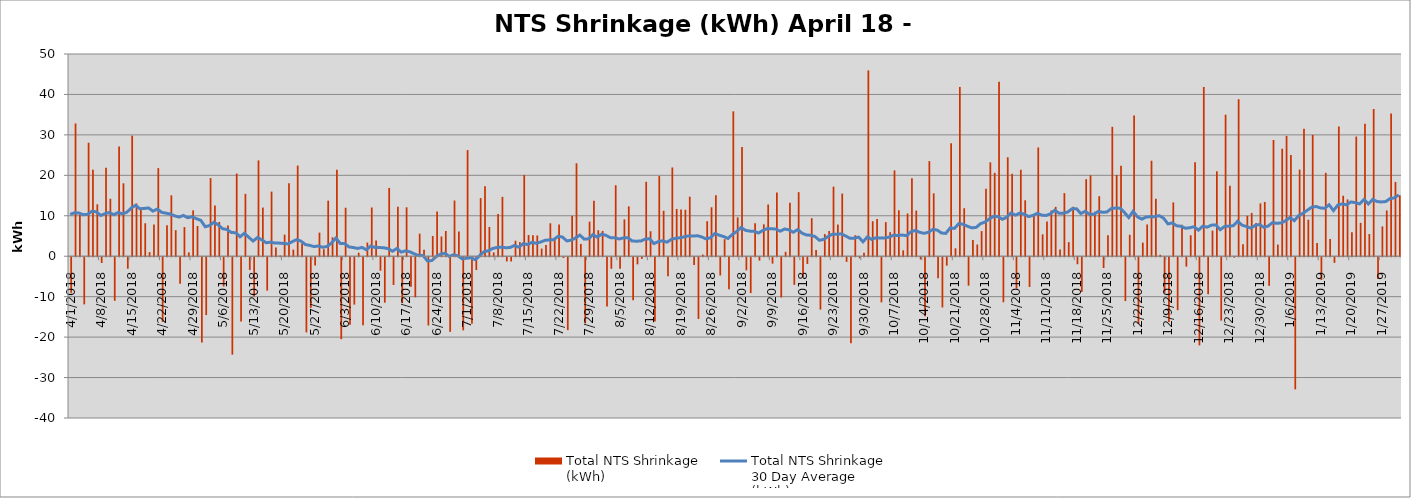
| Category | Total NTS Shrinkage
(kWh) |
|---|---|
| 4/1/18 | -8792530 |
| 4/2/18 | 32834545 |
| 4/3/18 | 10179991 |
| 4/4/18 | -11657593 |
| 4/5/18 | 28062721 |
| 4/6/18 | 21376540 |
| 4/7/18 | 12831044 |
| 4/8/18 | -1435382 |
| 4/9/18 | 21874602 |
| 4/10/18 | 14207387 |
| 4/11/18 | -10780226 |
| 4/12/18 | 27100684 |
| 4/13/18 | 18025390 |
| 4/14/18 | -2851554 |
| 4/15/18 | 29807993 |
| 4/16/18 | 13038217 |
| 4/17/18 | 11923369 |
| 4/18/18 | 8148474 |
| 4/19/18 | 1015356 |
| 4/20/18 | 7866046 |
| 4/21/18 | 21788290 |
| 4/22/18 | -16020216 |
| 4/23/18 | 7645514 |
| 4/24/18 | 15047579 |
| 4/25/18 | 6440771 |
| 4/26/18 | -6556387 |
| 4/27/18 | 7205433 |
| 4/28/18 | 945549 |
| 4/29/18 | 11339143 |
| 4/30/18 | 7467481 |
| 5/1/18 | -21088512 |
| 5/2/18 | -14309737 |
| 5/3/18 | 19314113 |
| 5/4/18 | 12513844 |
| 5/5/18 | 8476117 |
| 5/6/18 | -7231313 |
| 5/7/18 | 7584428 |
| 5/8/18 | -24085678 |
| 5/9/18 | 20438945 |
| 5/10/18 | -15920176 |
| 5/11/18 | 15421669 |
| 5/12/18 | -3150976 |
| 5/13/18 | -9720884 |
| 5/14/18 | 23687402 |
| 5/15/18 | 12031903 |
| 5/16/18 | -8251475 |
| 5/17/18 | 15979781 |
| 5/18/18 | 2153991 |
| 5/19/18 | 184363 |
| 5/20/18 | 5343752 |
| 5/21/18 | 18058094 |
| 5/22/18 | 1641055 |
| 5/23/18 | 22414349 |
| 5/24/18 | 3125869 |
| 5/25/18 | -18588789 |
| 5/26/18 | -12519348 |
| 5/27/18 | -2035233 |
| 5/28/18 | 5834420 |
| 5/29/18 | 1729932 |
| 5/30/18 | 13744297 |
| 5/31/18 | 4684604 |
| 6/1/18 | 21379042 |
| 6/2/18 | -20278760 |
| 6/3/18 | 11986756 |
| 6/4/18 | -16686667 |
| 6/5/18 | -11715027 |
| 6/6/18 | 872239 |
| 6/7/18 | -16791587 |
| 6/8/18 | 3376051 |
| 6/9/18 | 12048019 |
| 6/10/18 | 3911092 |
| 6/11/18 | -3335891 |
| 6/12/18 | -11243322 |
| 6/13/18 | 16888655 |
| 6/14/18 | -6868916 |
| 6/15/18 | 12234463 |
| 6/16/18 | -11335743 |
| 6/17/18 | 12097989 |
| 6/18/18 | -7272961 |
| 6/19/18 | -9910501 |
| 6/20/18 | 5584392 |
| 6/21/18 | 1604414 |
| 6/22/18 | -16865961 |
| 6/23/18 | 4991654 |
| 6/24/18 | 11036590 |
| 6/25/18 | 4880973 |
| 6/26/18 | 6230336 |
| 6/27/18 | -18451515 |
| 6/28/18 | 13772551 |
| 6/29/18 | 6140026 |
| 6/30/18 | -18080453 |
| 7/1/18 | 26241475 |
| 7/2/18 | -16474822 |
| 7/3/18 | -3160652 |
| 7/4/18 | 14371331 |
| 7/5/18 | 17290697 |
| 7/6/18 | 7242451 |
| 7/7/18 | 941301 |
| 7/8/18 | 10453916 |
| 7/9/18 | 14671011 |
| 7/10/18 | -1042026 |
| 7/11/18 | -1051272 |
| 7/12/18 | 3833283 |
| 7/13/18 | 3476910 |
| 7/14/18 | 20109509 |
| 7/15/18 | 5254840 |
| 7/16/18 | 5162329 |
| 7/17/18 | 5137844 |
| 7/18/18 | 1893712 |
| 7/19/18 | 2773134 |
| 7/20/18 | 8146507 |
| 7/21/18 | 4104264 |
| 7/22/18 | 7827355 |
| 7/23/18 | -184575 |
| 7/24/18 | -18015950 |
| 7/25/18 | 9986567 |
| 7/26/18 | 22976449 |
| 7/27/18 | 3037411 |
| 7/28/18 | -16343523 |
| 7/29/18 | 8550423 |
| 7/30/18 | 13703645 |
| 7/31/18 | 6421848 |
| 8/1/18 | 6258830 |
| 8/2/18 | -12188788 |
| 8/3/18 | -2855500 |
| 8/4/18 | 17554029 |
| 8/5/18 | -2845337 |
| 8/6/18 | 9120489 |
| 8/7/18 | 12320566 |
| 8/8/18 | -10645512 |
| 8/9/18 | -1767335 |
| 8/10/18 | -407770 |
| 8/11/18 | 18399787 |
| 8/12/18 | 6185348 |
| 8/13/18 | -15887183 |
| 8/14/18 | 19818877 |
| 8/15/18 | 11233864 |
| 8/16/18 | -4715098 |
| 8/17/18 | 21942572 |
| 8/18/18 | 11697655 |
| 8/19/18 | 11549996 |
| 8/20/18 | 11487185 |
| 8/21/18 | 14726911 |
| 8/22/18 | -1917939 |
| 8/23/18 | -15272931 |
| 8/24/18 | 399506 |
| 8/25/18 | 8655435 |
| 8/26/18 | 12107556 |
| 8/27/18 | 15056486 |
| 8/28/18 | -4513654 |
| 8/29/18 | 4216175 |
| 8/30/18 | -7897329 |
| 8/31/18 | 35826714 |
| 9/1/18 | 9608730 |
| 9/2/18 | 27022549 |
| 9/3/18 | -3240633 |
| 9/4/18 | -8869180 |
| 9/5/18 | 8126625 |
| 9/6/18 | -835503 |
| 9/7/18 | 7883601 |
| 9/8/18 | 12787875 |
| 9/9/18 | -1582848 |
| 9/10/18 | 15736286 |
| 9/11/18 | -9947753 |
| 9/12/18 | 1082880 |
| 9/13/18 | 13222377 |
| 9/14/18 | -6832433 |
| 9/15/18 | 15837461 |
| 9/16/18 | -5034067 |
| 9/17/18 | -1655632 |
| 9/18/18 | 9399716 |
| 9/19/18 | 1568137 |
| 9/20/18 | -12951900 |
| 9/21/18 | 5462340 |
| 9/22/18 | 6240296 |
| 9/23/18 | 17200996 |
| 9/24/18 | 7833984 |
| 9/25/18 | 15494095 |
| 9/26/18 | -1147991 |
| 9/27/18 | -21257782 |
| 9/28/18 | 5180946 |
| 9/29/18 | -255090 |
| 9/30/18 | 846703 |
| 10/1/18 | 45948300 |
| 10/2/18 | 8653339 |
| 10/3/18 | 9188847 |
| 10/4/18 | -11166997 |
| 10/5/18 | 8435426 |
| 10/6/18 | 5943948 |
| 10/7/18 | 21215707 |
| 10/8/18 | 11350171 |
| 10/9/18 | 1458014 |
| 10/10/18 | 10569147 |
| 10/11/18 | 19295146 |
| 10/12/18 | 11289663 |
| 10/13/18 | -559782 |
| 10/14/18 | -14605439 |
| 10/15/18 | 23511898 |
| 10/16/18 | 15543901 |
| 10/17/18 | -5185423 |
| 10/18/18 | -12417747 |
| 10/19/18 | -2087434 |
| 10/20/18 | 27921960 |
| 10/21/18 | 1960650 |
| 10/22/18 | 41854446 |
| 10/23/18 | 11861000 |
| 10/24/18 | -7043359 |
| 10/25/18 | 4031480 |
| 10/26/18 | 2888407 |
| 10/27/18 | 6217038 |
| 10/28/18 | 16657959 |
| 10/29/18 | 23217169 |
| 10/30/18 | 20609035 |
| 10/31/18 | 43128364 |
| 11/1/18 | -11132206 |
| 11/2/18 | 24476851 |
| 11/3/18 | 20388378 |
| 11/4/18 | -7745877 |
| 11/5/18 | 21380456 |
| 11/6/18 | 13830097 |
| 11/7/18 | -7354004 |
| 11/8/18 | 9927632 |
| 11/9/18 | 26893334 |
| 11/10/18 | 5409151 |
| 11/11/18 | 8613909 |
| 11/12/18 | 11319251 |
| 11/13/18 | 12198034 |
| 11/14/18 | 1669932 |
| 11/15/18 | 15600255 |
| 11/16/18 | 3471967 |
| 11/17/18 | 12242375 |
| 11/18/18 | -1740111 |
| 11/19/18 | -8573817 |
| 11/20/18 | 19043247 |
| 11/21/18 | 20002234 |
| 11/22/18 | 11004783 |
| 11/23/18 | 14837649 |
| 11/24/18 | -2675199 |
| 11/25/18 | 5187899 |
| 11/26/18 | 31994128 |
| 11/27/18 | 20102280 |
| 11/28/18 | 22353101 |
| 11/29/18 | -10843739 |
| 11/30/18 | 5315553 |
| 12/1/18 | 34770033 |
| 12/2/18 | -16514033 |
| 12/3/18 | 3370890 |
| 12/4/18 | 7851607 |
| 12/5/18 | 23611964 |
| 12/6/18 | 14223258 |
| 12/7/18 | 359571 |
| 12/8/18 | -8773379 |
| 12/9/18 | -16006803 |
| 12/10/18 | 13309872 |
| 12/11/18 | -13090689 |
| 12/12/18 | 7779131 |
| 12/13/18 | -2325582 |
| 12/14/18 | 5186305 |
| 12/15/18 | 23239572 |
| 12/16/18 | -21798485 |
| 12/17/18 | 41848126 |
| 12/18/18 | -9148526 |
| 12/19/18 | 6329059 |
| 12/20/18 | 20995170 |
| 12/21/18 | -15674375 |
| 12/22/18 | 34994510 |
| 12/23/18 | 17434863 |
| 12/24/18 | -107280 |
| 12/25/18 | 38818588 |
| 12/26/18 | 2947520 |
| 12/27/18 | 10006395 |
| 12/28/18 | 10704664 |
| 12/29/18 | 8196518 |
| 12/30/18 | 13065951 |
| 12/31/18 | 13416581 |
| 1/1/19 | -7067058 |
| 1/2/19 | 28748202 |
| 1/3/19 | 2884169 |
| 1/4/19 | 26581429 |
| 1/5/19 | 29745617 |
| 1/6/19 | 25024327 |
| 1/7/19 | -32667160 |
| 1/8/19 | 21417738 |
| 1/9/19 | 31502820 |
| 1/10/19 | 9024780 |
| 1/11/19 | 29993032 |
| 1/12/19 | 3266911 |
| 1/13/19 | -5617866 |
| 1/14/19 | 20623195 |
| 1/15/19 | 4237008 |
| 1/16/19 | -1391726 |
| 1/17/19 | 32073550 |
| 1/18/19 | 14954981 |
| 1/19/19 | 14046111 |
| 1/20/19 | 5939338 |
| 1/21/19 | 29583872 |
| 1/22/19 | 8241327 |
| 1/23/19 | 32780093 |
| 1/24/19 | 5502134 |
| 1/25/19 | 36399802 |
| 1/26/19 | -5405992 |
| 1/27/19 | 7373923 |
| 1/28/19 | 11317280 |
| 1/29/19 | 35268538 |
| 1/30/19 | 18368586 |
| 1/31/19 | 15066551 |